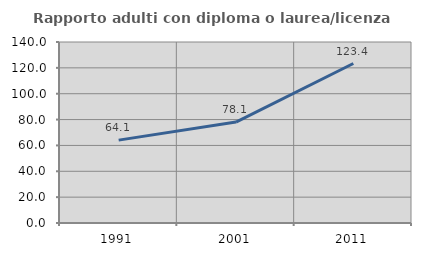
| Category | Rapporto adulti con diploma o laurea/licenza media  |
|---|---|
| 1991.0 | 64.101 |
| 2001.0 | 78.081 |
| 2011.0 | 123.368 |